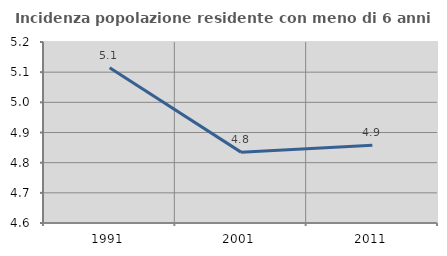
| Category | Incidenza popolazione residente con meno di 6 anni |
|---|---|
| 1991.0 | 5.115 |
| 2001.0 | 4.835 |
| 2011.0 | 4.858 |